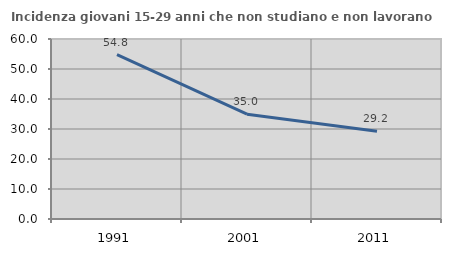
| Category | Incidenza giovani 15-29 anni che non studiano e non lavorano  |
|---|---|
| 1991.0 | 54.81 |
| 2001.0 | 34.951 |
| 2011.0 | 29.236 |